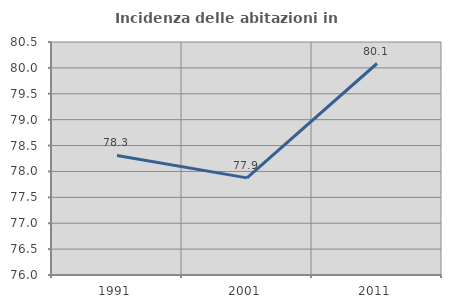
| Category | Incidenza delle abitazioni in proprietà  |
|---|---|
| 1991.0 | 78.309 |
| 2001.0 | 77.876 |
| 2011.0 | 80.085 |